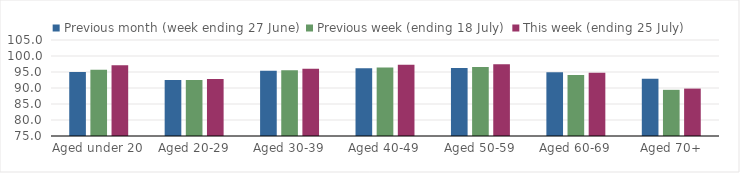
| Category | Previous month (week ending 27 June) | Previous week (ending 18 July) | This week (ending 25 July) |
|---|---|---|---|
| Aged under 20 | 94.969 | 95.694 | 97.134 |
| Aged 20-29 | 92.502 | 92.518 | 92.812 |
| Aged 30-39 | 95.371 | 95.536 | 96.021 |
| Aged 40-49 | 96.175 | 96.438 | 97.258 |
| Aged 50-59 | 96.272 | 96.534 | 97.44 |
| Aged 60-69 | 94.904 | 94.045 | 94.782 |
| Aged 70+ | 92.92 | 89.426 | 89.813 |